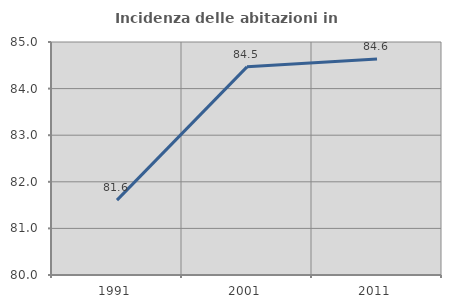
| Category | Incidenza delle abitazioni in proprietà  |
|---|---|
| 1991.0 | 81.608 |
| 2001.0 | 84.467 |
| 2011.0 | 84.633 |